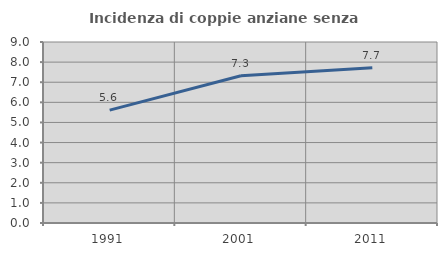
| Category | Incidenza di coppie anziane senza figli  |
|---|---|
| 1991.0 | 5.612 |
| 2001.0 | 7.323 |
| 2011.0 | 7.725 |